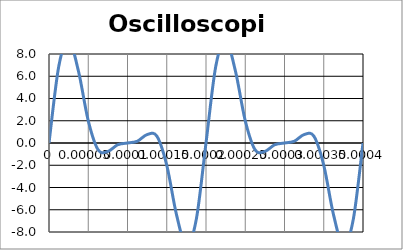
| Category | Vs |
|---|---|
| 0.0 | 0 |
| 1.25e-05 | 6.914 |
| 2.5e-05 | 9.243 |
| 3.7500000000000003e-05 | 6.466 |
| 5e-05 | 2 |
| 6.25e-05 | -0.605 |
| 7.500000000000001e-05 | -0.757 |
| 8.75e-05 | -0.157 |
| 0.0001 | 0 |
| 0.00011250000000000001 | 0.157 |
| 0.000125 | 0.757 |
| 0.0001375 | 0.605 |
| 0.00015000000000000001 | -2 |
| 0.00016250000000000002 | -6.466 |
| 0.000175 | -9.243 |
| 0.0001875 | -6.914 |
| 0.0002 | 0 |
| 0.00021250000000000002 | 6.914 |
| 0.00022500000000000002 | 9.243 |
| 0.0002375 | 6.466 |
| 0.00025 | 2 |
| 0.00026250000000000004 | -0.605 |
| 0.000275 | -0.757 |
| 0.0002875 | -0.157 |
| 0.00030000000000000003 | 0 |
| 0.0003125 | 0.157 |
| 0.00032500000000000004 | 0.757 |
| 0.0003375 | 0.605 |
| 0.00035 | -2 |
| 0.00036250000000000003 | -6.466 |
| 0.000375 | -9.243 |
| 0.00038750000000000004 | -6.914 |
| 0.0004 | 0 |